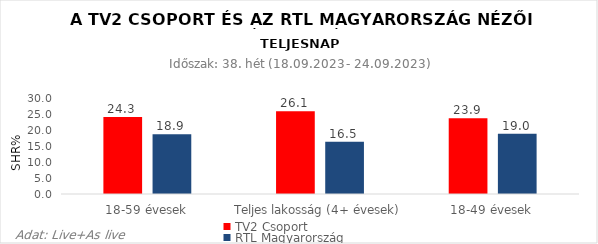
| Category | TV2 Csoport | RTL Magyarország |
|---|---|---|
| 18-59 évesek | 24.3 | 18.9 |
| Teljes lakosság (4+ évesek) | 26.1 | 16.5 |
| 18-49 évesek | 23.9 | 19 |